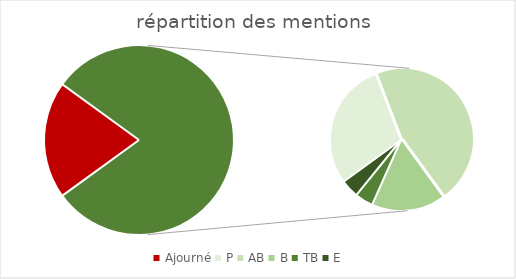
| Category | Series 0 |
|---|---|
| Ajourné | 6 |
| P | 7 |
| AB | 11 |
| B | 4 |
| TB | 1 |
| E | 1 |